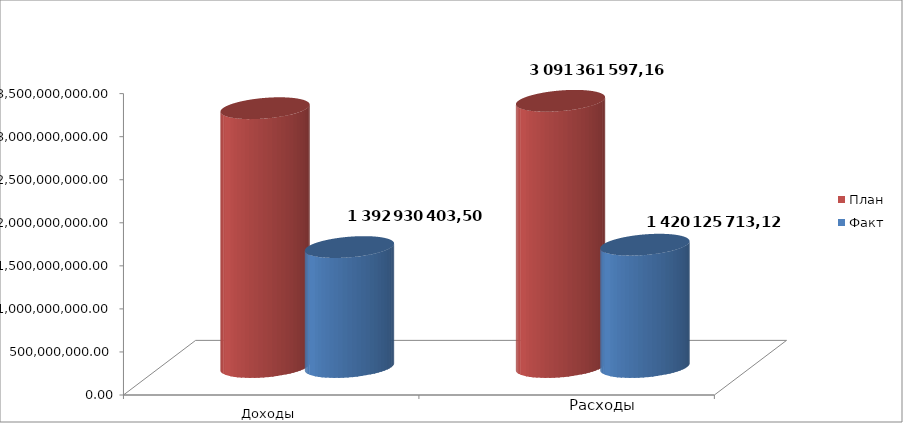
| Category | План | Факт |
|---|---|---|
| 0 | 3005479055.18 | 1392930403.5 |
| 1 | 3091361597.16 | 1420125713.12 |